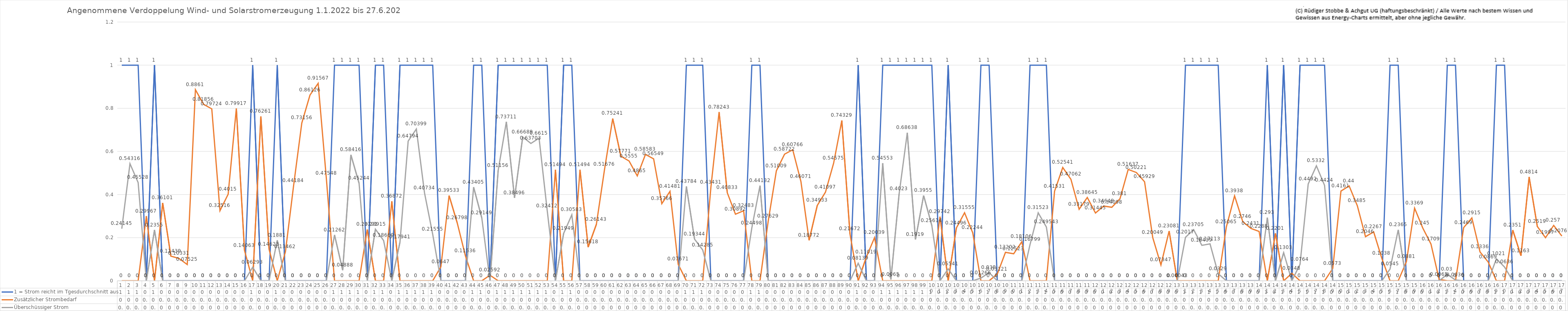
| Category | 1 = Strom reicht im Tgesdurchschnitt aus | Zusätzlicher Strombedarf | Überschüssiger Strom |
|---|---|---|---|
| 0 | 1 | 0 | 0.241 |
| 1 | 1 | 0 | 0.543 |
| 2 | 1 | 0 | 0.455 |
| 3 | 0 | 0.3 | 0 |
| 4 | 1 | 0 | 0.236 |
| 5 | 0 | 0.361 | 0 |
| 6 | 0 | 0.114 | 0 |
| 7 | 0 | 0.103 | 0 |
| 8 | 0 | 0.075 | 0 |
| 9 | 0 | 0.886 | 0 |
| 10 | 0 | 0.819 | 0 |
| 11 | 0 | 0.797 | 0 |
| 12 | 0 | 0.325 | 0 |
| 13 | 0 | 0.402 | 0 |
| 14 | 0 | 0.799 | 0 |
| 15 | 0 | 0.141 | 0 |
| 16 | 1 | 0 | 0.063 |
| 17 | 0 | 0.763 | 0 |
| 18 | 0 | 0.146 | 0 |
| 19 | 1 | 0 | 0.188 |
| 20 | 0 | 0.135 | 0 |
| 21 | 0 | 0.442 | 0 |
| 22 | 0 | 0.732 | 0 |
| 23 | 0 | 0.861 | 0 |
| 24 | 0 | 0.916 | 0 |
| 25 | 0 | 0.475 | 0 |
| 26 | 1 | 0 | 0.213 |
| 27 | 1 | 0 | 0.049 |
| 28 | 1 | 0 | 0.584 |
| 29 | 1 | 0 | 0.452 |
| 30 | 0 | 0.238 | 0 |
| 31 | 1 | 0 | 0.239 |
| 32 | 1 | 0 | 0.187 |
| 33 | 0 | 0.369 | 0 |
| 34 | 1 | 0 | 0.179 |
| 35 | 1 | 0 | 0.648 |
| 36 | 1 | 0 | 0.704 |
| 37 | 1 | 0 | 0.407 |
| 38 | 1 | 0 | 0.216 |
| 39 | 0 | 0.065 | 0 |
| 40 | 0 | 0.395 | 0 |
| 41 | 0 | 0.268 | 0 |
| 42 | 0 | 0.115 | 0 |
| 43 | 1 | 0 | 0.434 |
| 44 | 1 | 0 | 0.291 |
| 45 | 0 | 0.026 | 0 |
| 46 | 1 | 0 | 0.512 |
| 47 | 1 | 0 | 0.737 |
| 48 | 1 | 0 | 0.385 |
| 49 | 1 | 0 | 0.667 |
| 50 | 1 | 0 | 0.637 |
| 51 | 1 | 0 | 0.661 |
| 52 | 1 | 0 | 0.324 |
| 53 | 0 | 0.515 | 0 |
| 54 | 1 | 0 | 0.219 |
| 55 | 1 | 0 | 0.306 |
| 56 | 0 | 0.515 | 0 |
| 57 | 0 | 0.156 | 0 |
| 58 | 0 | 0.261 | 0 |
| 59 | 0 | 0.517 | 0 |
| 60 | 0 | 0.752 | 0 |
| 61 | 0 | 0.578 | 0 |
| 62 | 0 | 0.556 | 0 |
| 63 | 0 | 0.487 | 0 |
| 64 | 0 | 0.586 | 0 |
| 65 | 0 | 0.565 | 0 |
| 66 | 0 | 0.358 | 0 |
| 67 | 0 | 0.415 | 0 |
| 68 | 0 | 0.077 | 0 |
| 69 | 1 | 0 | 0.438 |
| 70 | 1 | 0 | 0.193 |
| 71 | 1 | 0 | 0.143 |
| 72 | 0 | 0.434 | 0 |
| 73 | 0 | 0.782 | 0 |
| 74 | 0 | 0.408 | 0 |
| 75 | 0 | 0.309 | 0 |
| 76 | 0 | 0.325 | 0 |
| 77 | 1 | 0 | 0.245 |
| 78 | 1 | 0 | 0.441 |
| 79 | 0 | 0.276 | 0 |
| 80 | 0 | 0.51 | 0 |
| 81 | 0 | 0.587 | 0 |
| 82 | 0 | 0.608 | 0 |
| 83 | 0 | 0.461 | 0 |
| 84 | 0 | 0.188 | 0 |
| 85 | 0 | 0.349 | 0 |
| 86 | 0 | 0.411 | 0 |
| 87 | 0 | 0.546 | 0 |
| 88 | 0 | 0.743 | 0 |
| 89 | 0 | 0.217 | 0 |
| 90 | 1 | 0 | 0.081 |
| 91 | 0 | 0.11 | 0 |
| 92 | 0 | 0.2 | 0 |
| 93 | 1 | 0 | 0.546 |
| 94 | 1 | 0 | 0.006 |
| 95 | 1 | 0 | 0.402 |
| 96 | 1 | 0 | 0.686 |
| 97 | 1 | 0 | 0.192 |
| 98 | 1 | 0 | 0.396 |
| 99 | 1 | 0 | 0.256 |
| 100 | 0 | 0.297 | 0 |
| 101 | 1 | 0 | 0.055 |
| 102 | 0 | 0.245 | 0 |
| 103 | 0 | 0.316 | 0 |
| 104 | 0 | 0.222 | 0 |
| 105 | 1 | 0 | 0.013 |
| 106 | 1 | 0 | 0.038 |
| 107 | 0 | 0.031 | 0 |
| 108 | 0 | 0.132 | 0 |
| 109 | 0 | 0.125 | 0 |
| 110 | 0 | 0.181 | 0 |
| 111 | 1 | 0 | 0.168 |
| 112 | 1 | 0 | 0.315 |
| 113 | 1 | 0 | 0.25 |
| 114 | 0 | 0.415 | 0 |
| 115 | 0 | 0.525 | 0 |
| 116 | 0 | 0.471 | 0 |
| 117 | 0 | 0.332 | 0 |
| 118 | 0 | 0.386 | 0 |
| 119 | 0 | 0.314 | 0 |
| 120 | 0 | 0.346 | 0 |
| 121 | 0 | 0.341 | 0 |
| 122 | 0 | 0.381 | 0 |
| 123 | 0 | 0.516 | 0 |
| 124 | 0 | 0.502 | 0 |
| 125 | 0 | 0.459 | 0 |
| 126 | 0 | 0.2 | 0 |
| 127 | 0 | 0.073 | 0 |
| 128 | 0 | 0.231 | 0 |
| 129 | 0 | 0 | 0 |
| 130 | 1 | 0 | 0.202 |
| 131 | 1 | 0 | 0.237 |
| 132 | 1 | 0 | 0.164 |
| 133 | 1 | 0 | 0.171 |
| 134 | 1 | 0 | 0.033 |
| 135 | 0 | 0.251 | 0 |
| 136 | 0 | 0.394 | 0 |
| 137 | 0 | 0.275 | 0 |
| 138 | 0 | 0.243 | 0 |
| 139 | 0 | 0.229 | 0 |
| 140 | 1 | 0 | 0.293 |
| 141 | 0 | 0.22 | 0 |
| 142 | 1 | 0 | 0.13 |
| 143 | 0 | 0.035 | 0 |
| 144 | 1 | 0 | 0.076 |
| 145 | 1 | 0 | 0.449 |
| 146 | 1 | 0 | 0.533 |
| 147 | 1 | 0 | 0.442 |
| 148 | 0 | 0.057 | 0 |
| 149 | 0 | 0.416 | 0 |
| 150 | 0 | 0.44 | 0 |
| 151 | 0 | 0.348 | 0 |
| 152 | 0 | 0.205 | 0 |
| 153 | 0 | 0.227 | 0 |
| 154 | 0 | 0.104 | 0 |
| 155 | 1 | 0 | 0.054 |
| 156 | 1 | 0 | 0.237 |
| 157 | 0 | 0.088 | 0 |
| 158 | 0 | 0.337 | 0 |
| 159 | 0 | 0.245 | 0 |
| 160 | 0 | 0.171 | 0 |
| 161 | 0 | 0.007 | 0 |
| 162 | 1 | 0 | 0.03 |
| 163 | 1 | 0 | 0.004 |
| 164 | 0 | 0.247 | 0 |
| 165 | 0 | 0.292 | 0 |
| 166 | 0 | 0.134 | 0 |
| 167 | 0 | 0.087 | 0 |
| 168 | 1 | 0 | 0.102 |
| 169 | 1 | 0 | 0.064 |
| 170 | 0 | 0.235 | 0 |
| 171 | 0 | 0.116 | 0 |
| 172 | 0 | 0.481 | 0 |
| 173 | 0 | 0.252 | 0 |
| 174 | 0 | 0.2 | 0 |
| 175 | 0 | 0.257 | 0 |
| 176 | 0 | 0.208 | 0 |